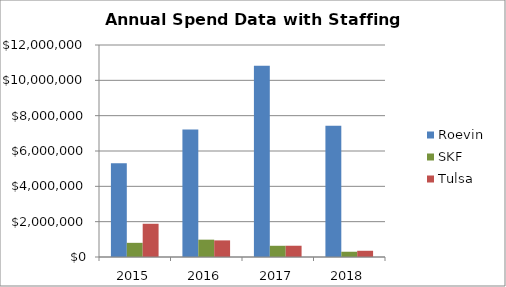
| Category | Roevin  | SKF | Tulsa |
|---|---|---|---|
| 2015.0 | 5306331.57 | 802076.26 | 1880722.08 |
| 2016.0 | 7222911.42 | 981248.65 | 940204.61 |
| 2017.0 | 10822998.08 | 635047.41 | 637539.8 |
| 2018.0 | 7425789.81 | 297997.51 | 352287 |